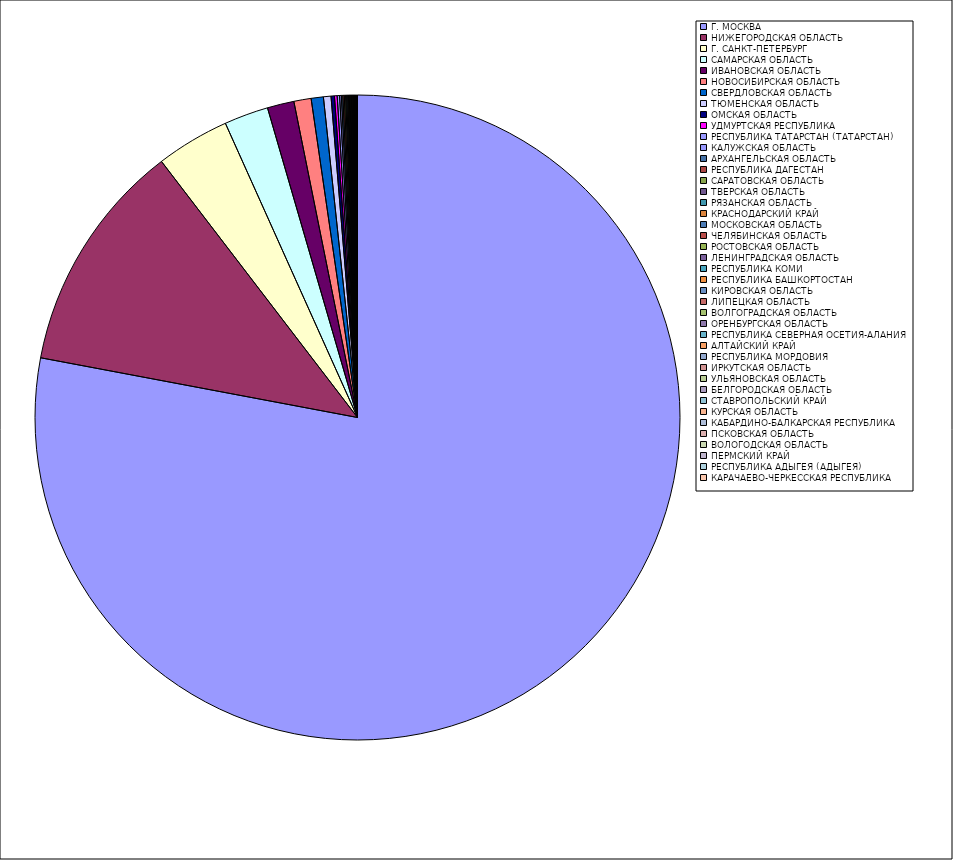
| Category | Оборот |
|---|---|
| Г. МОСКВА | 77.936 |
| НИЖЕГОРОДСКАЯ ОБЛАСТЬ | 11.631 |
| Г. САНКТ-ПЕТЕРБУРГ | 3.68 |
| САМАРСКАЯ ОБЛАСТЬ | 2.214 |
| ИВАНОВСКАЯ ОБЛАСТЬ | 1.339 |
| НОВОСИБИРСКАЯ ОБЛАСТЬ | 0.864 |
| СВЕРДЛОВСКАЯ ОБЛАСТЬ | 0.611 |
| ТЮМЕНСКАЯ ОБЛАСТЬ | 0.378 |
| ОМСКАЯ ОБЛАСТЬ | 0.169 |
| УДМУРТСКАЯ РЕСПУБЛИКА | 0.135 |
| РЕСПУБЛИКА ТАТАРСТАН (ТАТАРСТАН) | 0.12 |
| КАЛУЖСКАЯ ОБЛАСТЬ | 0.087 |
| АРХАНГЕЛЬСКАЯ ОБЛАСТЬ | 0.073 |
| РЕСПУБЛИКА ДАГЕСТАН | 0.072 |
| САРАТОВСКАЯ ОБЛАСТЬ | 0.064 |
| ТВЕРСКАЯ ОБЛАСТЬ | 0.053 |
| РЯЗАНСКАЯ ОБЛАСТЬ | 0.051 |
| КРАСНОДАРСКИЙ КРАЙ | 0.041 |
| МОСКОВСКАЯ ОБЛАСТЬ | 0.039 |
| ЧЕЛЯБИНСКАЯ ОБЛАСТЬ | 0.038 |
| РОСТОВСКАЯ ОБЛАСТЬ | 0.035 |
| ЛЕНИНГРАДСКАЯ ОБЛАСТЬ | 0.033 |
| РЕСПУБЛИКА КОМИ | 0.033 |
| РЕСПУБЛИКА БАШКОРТОСТАН | 0.032 |
| КИРОВСКАЯ ОБЛАСТЬ | 0.028 |
| ЛИПЕЦКАЯ ОБЛАСТЬ | 0.026 |
| ВОЛГОГРАДСКАЯ ОБЛАСТЬ | 0.023 |
| ОРЕНБУРГСКАЯ ОБЛАСТЬ | 0.019 |
| РЕСПУБЛИКА СЕВЕРНАЯ ОСЕТИЯ-АЛАНИЯ | 0.019 |
| АЛТАЙСКИЙ КРАЙ | 0.014 |
| РЕСПУБЛИКА МОРДОВИЯ | 0.013 |
| ИРКУТСКАЯ ОБЛАСТЬ | 0.011 |
| УЛЬЯНОВСКАЯ ОБЛАСТЬ | 0.011 |
| БЕЛГОРОДСКАЯ ОБЛАСТЬ | 0.011 |
| СТАВРОПОЛЬСКИЙ КРАЙ | 0.009 |
| КУРСКАЯ ОБЛАСТЬ | 0.009 |
| КАБАРДИНО-БАЛКАРСКАЯ РЕСПУБЛИКА | 0.009 |
| ПСКОВСКАЯ ОБЛАСТЬ | 0.008 |
| ВОЛОГОДСКАЯ ОБЛАСТЬ | 0.008 |
| ПЕРМСКИЙ КРАЙ | 0.007 |
| РЕСПУБЛИКА АДЫГЕЯ (АДЫГЕЯ) | 0.005 |
| КАРАЧАЕВО-ЧЕРКЕССКАЯ РЕСПУБЛИКА | 0.005 |